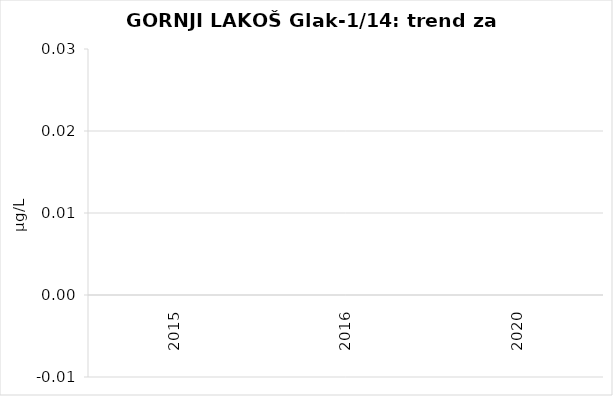
| Category | Vsota |
|---|---|
| 2015 | 0 |
| 2016 | 0 |
| 2020 | 0 |